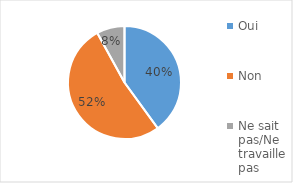
| Category | Series 0 |
|---|---|
| Oui | 0.4 |
| Non | 0.52 |
| Ne sait pas/Ne travaille pas | 0.08 |